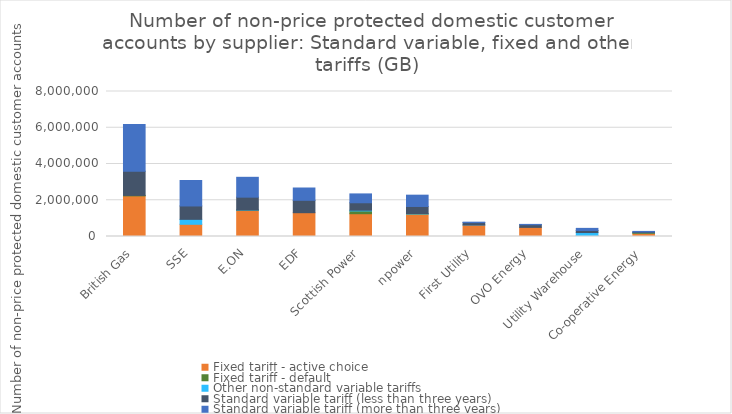
| Category | Fixed tariff - active choice | Fixed tariff - default | Other non-standard variable tariffs | Standard variable tariff (less than three years) | Standard variable tariff (more than three years) |
|---|---|---|---|---|---|
| British Gas | 2240962 | 26997 | 0 | 1333364 | 2575593 |
| SSE | 673929 | 0 | 272234 | 738092 | 1406634 |
| E.ON | 1444997 | 11730 | 9314 | 704896 | 1095021 |
| EDF | 1312722 | 0 | 0 | 683876 | 679064 |
| Scottish Power | 1257660 | 151273 | 42104 | 410840 | 487918 |
| npower | 1240364 | 4040 | 24345 | 388010 | 623593 |
| First Utility | 635915 | 0 | 742 | 130412 | 23331 |
| OVO Energy | 502898 | 0 | 0 | 146946 | 17425 |
| Utility Warehouse | 57193 | 0 | 160688 | 115686 | 114577 |
| Co-operative Energy | 174104 | 39319 | 2176 | 38221 | 26577 |